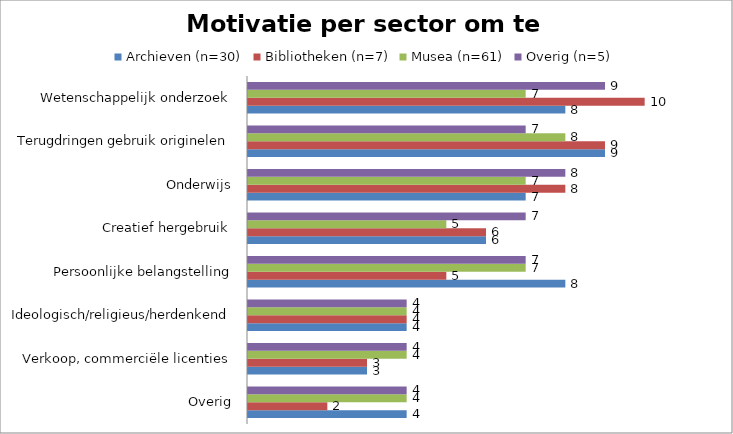
| Category | Archieven (n=30) | Bibliotheken (n=7) | Musea (n=61) | Overig (n=5) |
|---|---|---|---|---|
| Overig | 4 | 2 | 4 | 4 |
| Verkoop, commerciële licenties | 3 | 3 | 4 | 4 |
| Ideologisch/religieus/herdenkend | 4 | 4 | 4 | 4 |
| Persoonlijke belangstelling | 8 | 5 | 7 | 7 |
| Creatief hergebruik | 6 | 6 | 5 | 7 |
| Onderwijs | 7 | 8 | 7 | 8 |
| Terugdringen gebruik originelen | 9 | 9 | 8 | 7 |
| Wetenschappelijk onderzoek | 8 | 10 | 7 | 9 |